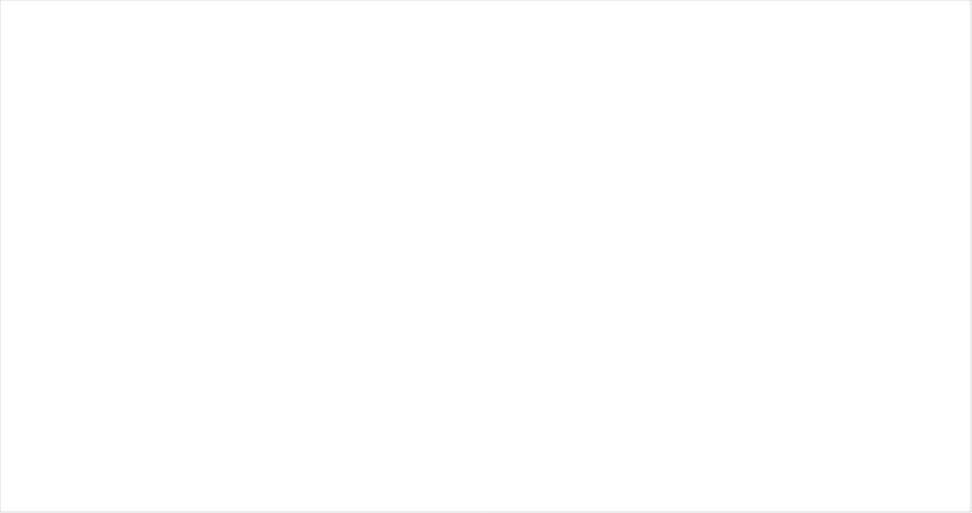
| Category | Lichte adviestoevoegingen | Mediation toevoegingen | Reguliere toevoegingen |
|---|---|---|---|
| 2008 | 15294 | 5524 | 401712 |
| 2009 | 13792 | 6866 | 414935 |
| 2010 | 9884 | 7330 | 412756 |
| 2011 | 8311 | 7341 | 398355 |
| 2012 | 10578 | 8501 | 430614 |
| 2013 | 9990 | 10386 | 432745 |
| 2014 | 10190 | 13425 | 420833 |
| 2015 | 9603 | 15253 | 409957 |
| 2016 | 9054 | 17209 | 419442 |
| 2017 | 8529 | 17295 | 389794 |
| 2018 | 8351 | 17215 | 381597 |
| 2019 | 8390 | 16580 | 376660 |
| 2020 | 7866 | 14417 | 352325 |
| 2021 | 7245 | 12531 | 328039 |
| 2022 | 10623 | 13096 | 348021 |